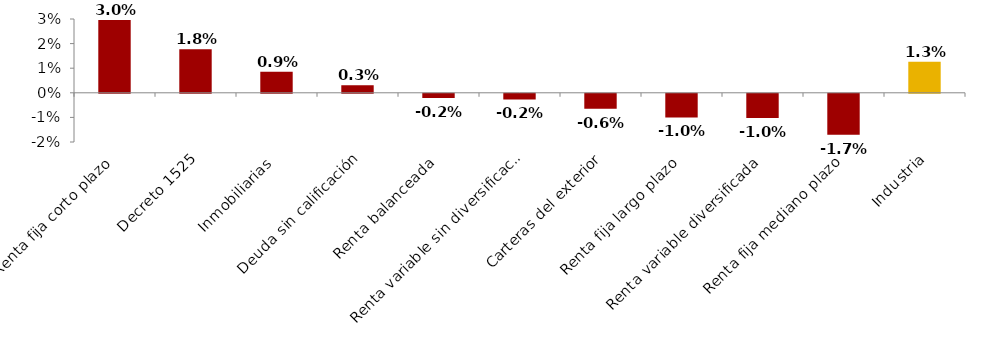
| Category | Series 0 |
|---|---|
| Renta fija corto plazo | 0.03 |
| Decreto 1525 | 0.018 |
| Inmobiliarias | 0.009 |
| Deuda sin calificación | 0.003 |
| Renta balanceada | -0.002 |
| Renta variable sin diversificación | -0.002 |
| Carteras del exterior | -0.006 |
| Renta fija largo plazo | -0.01 |
| Renta variable diversificada | -0.01 |
| Renta fija mediano plazo | -0.017 |
| Industria | 0.013 |